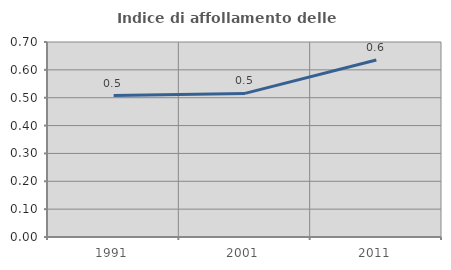
| Category | Indice di affollamento delle abitazioni  |
|---|---|
| 1991.0 | 0.508 |
| 2001.0 | 0.515 |
| 2011.0 | 0.636 |